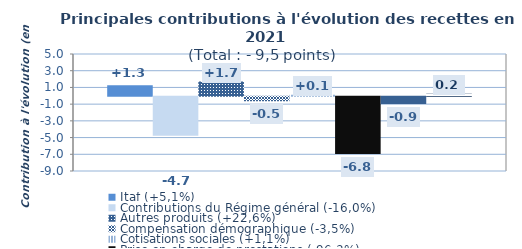
| Category | Itaf (+5,1%) | Contributions du Régime général (-16,0%) | Autres produits (+22,6%) | Compensation démographique (-3,5%) | Cotisations sociales (+1,1%) | Prise en charge de prestations (-96,3%) | Contribution Sociale Généralisée (-27,4%) | Cotisations prises en charge par l'Etat (+98,2%) |
|---|---|---|---|---|---|---|---|---|
| Contri croiss | 1.253 | -4.651 | 1.699 | -0.524 | 0.138 | -6.837 | -0.868 | 0.248 |